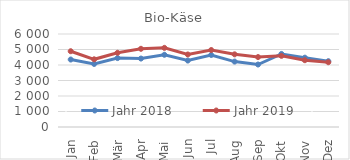
| Category | Jahr 2018 | Jahr 2019 |
|---|---|---|
| Jan | 4353.001 | 4889.487 |
| Feb | 4066.819 | 4366.572 |
| Mär | 4446.267 | 4788.7 |
| Apr | 4415.269 | 5044.958 |
| Mai | 4659.821 | 5106.103 |
| Jun | 4285.81 | 4678.823 |
| Jul | 4645.796 | 4966.112 |
| Aug | 4219.614 | 4688.367 |
| Sep | 4031.524 | 4511.594 |
| Okt | 4713.261 | 4589.159 |
| Nov | 4472.453 | 4308.519 |
| Dez | 4244.969 | 4177.057 |